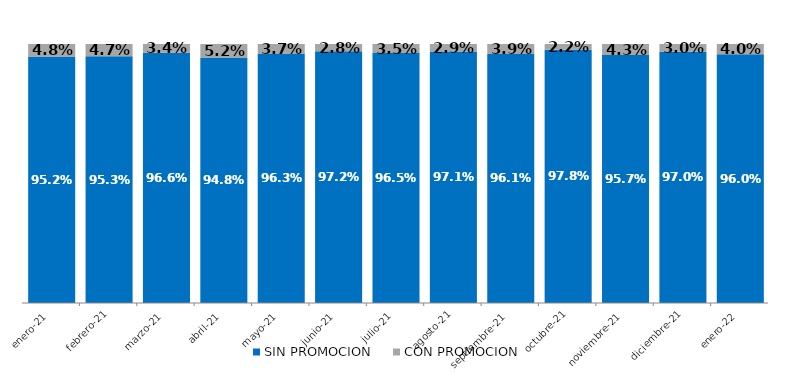
| Category | SIN PROMOCION   | CON PROMOCION   |
|---|---|---|
| 2021-01-01 | 0.952 | 0.048 |
| 2021-02-01 | 0.953 | 0.047 |
| 2021-03-01 | 0.966 | 0.034 |
| 2021-04-01 | 0.948 | 0.052 |
| 2021-05-01 | 0.963 | 0.037 |
| 2021-06-01 | 0.972 | 0.028 |
| 2021-07-01 | 0.965 | 0.035 |
| 2021-08-01 | 0.971 | 0.029 |
| 2021-09-01 | 0.961 | 0.039 |
| 2021-10-01 | 0.978 | 0.022 |
| 2021-11-01 | 0.957 | 0.043 |
| 2021-12-01 | 0.97 | 0.03 |
| 2022-01-01 | 0.96 | 0.04 |